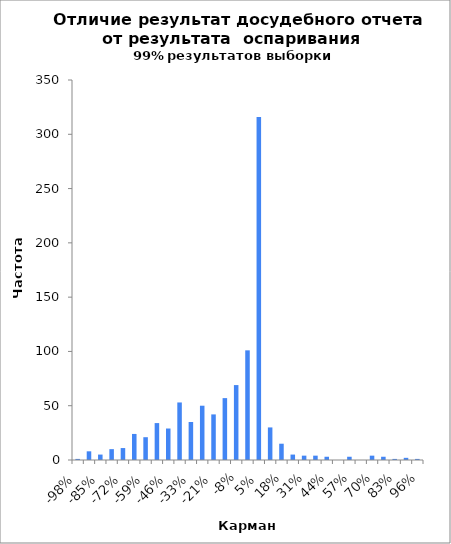
| Category | Частота |
|---|---|
| -0.9803396846254928 | 1 |
| -0.9157966280024332 | 8 |
| -0.8512535713793737 | 5 |
| -0.7867105147563143 | 10 |
| -0.7221674581332547 | 11 |
| -0.6576244015101951 | 24 |
| -0.5930813448871356 | 21 |
| -0.5285382882640761 | 34 |
| -0.4639952316410165 | 29 |
| -0.39945217501795693 | 53 |
| -0.33490911839489745 | 35 |
| -0.270366061771838 | 50 |
| -0.20582300514877838 | 42 |
| -0.1412799485257188 | 57 |
| -0.07673689190265931 | 69 |
| -0.01219383527959983 | 101 |
| 0.05234922134345976 | 316 |
| 0.11689227796651935 | 30 |
| 0.18143533458957894 | 15 |
| 0.24597839121263831 | 5 |
| 0.3105214478356979 | 4 |
| 0.3750645044587575 | 4 |
| 0.43960756108181687 | 3 |
| 0.5041506177048765 | 0 |
| 0.568693674327936 | 3 |
| 0.6332367309509956 | 0 |
| 0.6977797875740552 | 4 |
| 0.7623228441971146 | 3 |
| 0.8268659008201742 | 1 |
| 0.8914089574432338 | 2 |
| 0.96 | 1 |